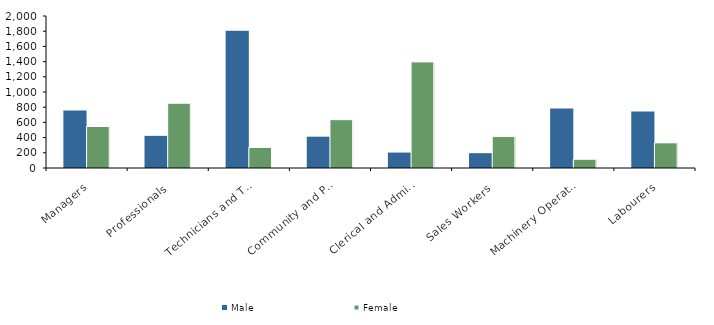
| Category | Male | Female |
|---|---|---|
| Managers | 755 | 546 |
| Professionals | 423 | 852 |
| Technicians and Trades Workers | 1806 | 270 |
| Community and Personal Service Workers | 412 | 636 |
| Clerical and Administrative Workers | 203 | 1396 |
| Sales Workers | 195 | 414 |
| Machinery Operators and Drivers | 783 | 115 |
| Labourers | 744 | 331 |